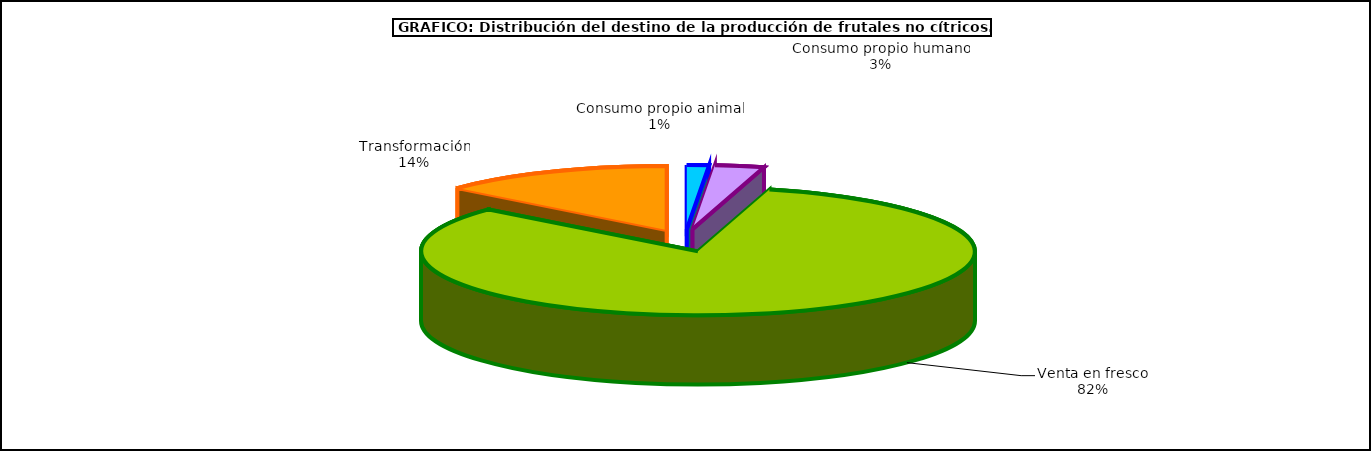
| Category | frutales no cítricos |
|---|---|
| 0 | 57633 |
| 1 | 128808 |
| 2 | 3692222 |
| 3 | 612083 |